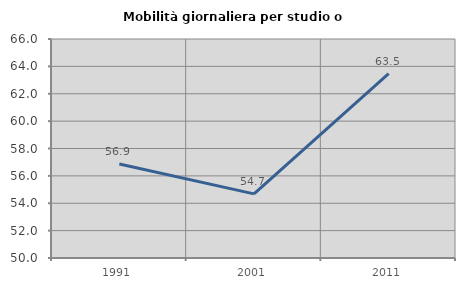
| Category | Mobilità giornaliera per studio o lavoro |
|---|---|
| 1991.0 | 56.873 |
| 2001.0 | 54.683 |
| 2011.0 | 63.478 |